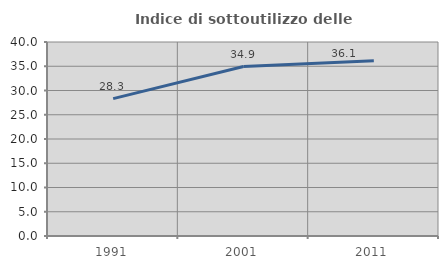
| Category | Indice di sottoutilizzo delle abitazioni  |
|---|---|
| 1991.0 | 28.333 |
| 2001.0 | 34.934 |
| 2011.0 | 36.111 |